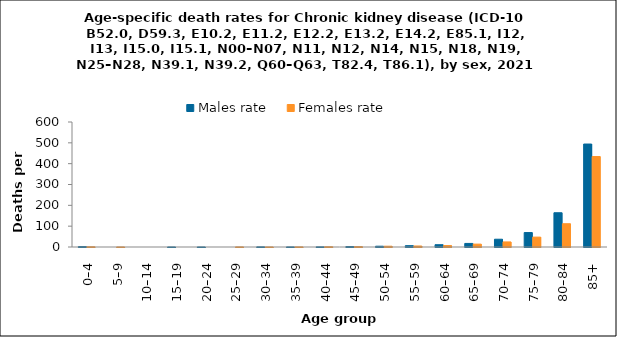
| Category | Males rate | Females rate |
|---|---|---|
| 0–4 | 2.061 | 1.09 |
| 5–9 | 0 | 0.127 |
| 10–14 | 0 | 0 |
| 15–19 | 0.131 | 0 |
| 20–24 | 0.119 | 0 |
| 25–29 | 0 | 0.332 |
| 30–34 | 0.638 | 0.104 |
| 35–39 | 0.323 | 0.426 |
| 40–44 | 0.613 | 1.192 |
| 45–49 | 2.325 | 1.801 |
| 50–54 | 3.778 | 3.793 |
| 55–59 | 6.426 | 4.823 |
| 60–64 | 10.968 | 6.898 |
| 65–69 | 17.165 | 13.734 |
| 70–74 | 37.318 | 24.321 |
| 75–79 | 69.358 | 47.454 |
| 80–84 | 164.425 | 111.696 |
| 85+ | 494.213 | 434.177 |